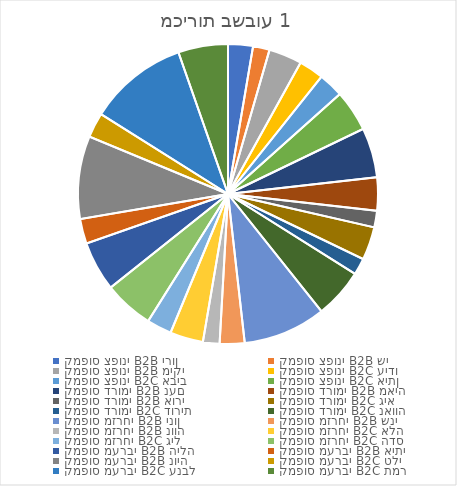
| Category | מכירות בשבוע 1 |
|---|---|
| 0 | 30 |
| 1 | 20 |
| 2 | 40 |
| 3 | 30 |
| 4 | 30 |
| 5 | 50 |
| 6 | 60 |
| 7 | 40 |
| 8 | 20 |
| 9 | 40 |
| 10 | 20 |
| 11 | 60 |
| 12 | 100 |
| 13 | 30 |
| 14 | 20 |
| 15 | 40 |
| 16 | 30 |
| 17 | 60 |
| 18 | 60 |
| 19 | 30 |
| 20 | 100 |
| 21 | 30 |
| 22 | 120 |
| 23 | 60 |